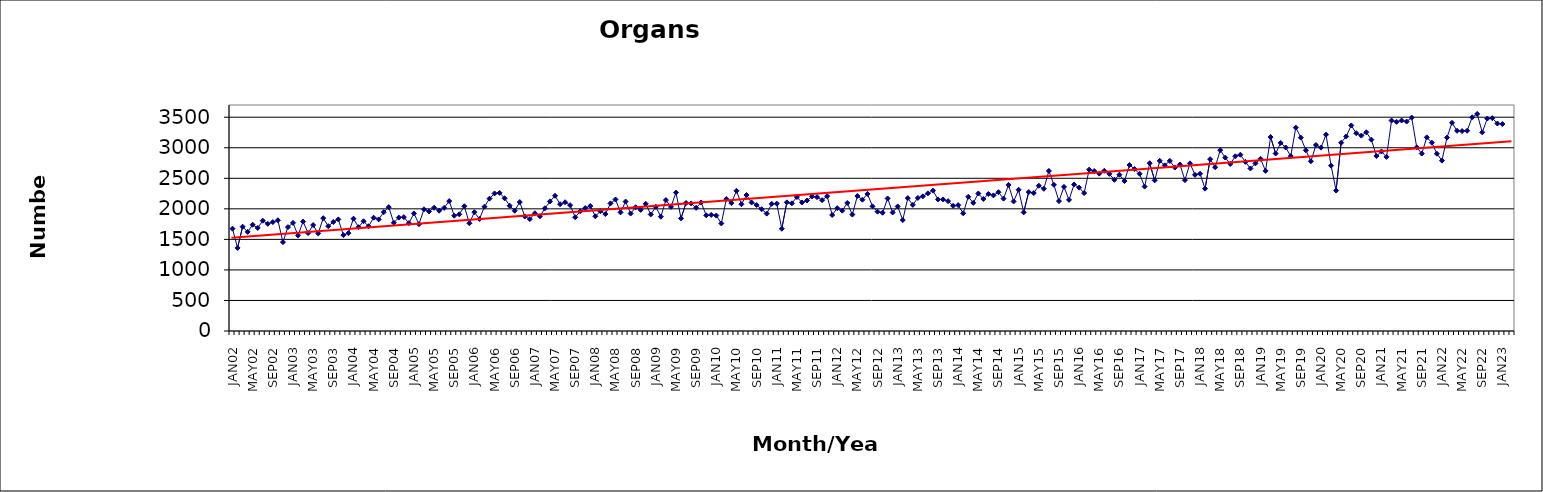
| Category | Series 0 |
|---|---|
| JAN02 | 1675 |
| FEB02 | 1360 |
| MAR02 | 1708 |
| APR02 | 1623 |
| MAY02 | 1740 |
| JUN02 | 1687 |
| JUL02 | 1806 |
| AUG02 | 1755 |
| SEP02 | 1783 |
| OCT02 | 1813 |
| NOV02 | 1455 |
| DEC02 | 1701 |
| JAN03 | 1770 |
| FEB03 | 1565 |
| MAR03 | 1791 |
| APR03 | 1603 |
| MAY03 | 1734 |
| JUN03 | 1598 |
| JUL03 | 1847 |
| AUG03 | 1716 |
| SEP03 | 1785 |
| OCT03 | 1827 |
| NOV03 | 1570 |
| DEC03 | 1602 |
| JAN04 | 1839 |
| FEB04 | 1700 |
| MAR04 | 1797 |
| APR04 | 1715 |
| MAY04 | 1855 |
| JUN04 | 1827 |
| JUL04 | 1945 |
| AUG04 | 2028 |
| SEP04 | 1773 |
| OCT04 | 1857 |
| NOV04 | 1864 |
| DEC04 | 1766 |
| JAN05 | 1925 |
| FEB05 | 1750 |
| MAR05 | 1993 |
| APR05 | 1957 |
| MAY05 | 2018 |
| JUN05 | 1969 |
| JUL05 | 2016 |
| AUG05 | 2127 |
| SEP05 | 1888 |
| OCT05 | 1910 |
| NOV05 | 2042 |
| DEC05 | 1764 |
| JAN06 | 1945 |
| FEB06 | 1834 |
| MAR06 | 2035 |
| APR06 | 2167 |
| MAY06 | 2252 |
| JUN06 | 2261 |
| JUL06 | 2172 |
| AUG06 | 2051 |
| SEP06 | 1969 |
| OCT06 | 2111 |
| NOV06 | 1875 |
| DEC06 | 1832 |
| JAN07 | 1927 |
| FEB07 | 1878 |
| MAR07 | 2009 |
| APR07 | 2122 |
| MAY07 | 2214 |
| JUN07 | 2076 |
| JUL07 | 2108 |
| AUG07 | 2060 |
| SEP07 | 1863 |
| OCT07 | 1959 |
| NOV07 | 2012 |
| DEC07 | 2046 |
| JAN08 | 1878 |
| FEB08 | 1962 |
| MAR08 | 1914 |
| APR08 | 2089 |
| MAY08 | 2153 |
| JUN08 | 1942 |
| JUL08 | 2119 |
| AUG08 | 1923 |
| SEP08 | 2026 |
| OCT08 | 1983 |
| NOV08 | 2082 |
| DEC08 | 1908 |
| JAN09 | 2033 |
| FEB09 | 1871 |
| MAR09 | 2143 |
| APR09 | 2032 |
| MAY09 | 2266 |
| JUN09 | 1844 |
| JUL09 | 2096 |
| AUG09 | 2089 |
| SEP09 | 2016 |
| OCT09 | 2104 |
| NOV09 | 1894 |
| DEC09 | 1901 |
| JAN10 | 1890 |
| FEB10 | 1761 |
| MAR10 | 2160 |
| APR10 | 2094 |
| MAY10 | 2295 |
| JUN10 | 2075 |
| JUL10 | 2226 |
| AUG10 | 2104 |
| SEP10 | 2062 |
| OCT10 | 1994 |
| NOV10 | 1922 |
| DEC10 | 2082 |
| JAN11 | 2085 |
| FEB11 | 1674 |
| MAR11 | 2106 |
| APR11 | 2090 |
| MAY11 | 2194 |
| JUN11 | 2105 |
| JUL11 | 2136 |
| AUG11 | 2202 |
| SEP11 | 2192 |
| OCT11 | 2142 |
| NOV11 | 2207 |
| DEC11 | 1899 |
| JAN12 | 2011 |
| FEB12 | 1970 |
| MAR12 | 2096 |
| APR12 | 1906 |
| MAY12 | 2210 |
| JUN12 | 2150 |
| JUL12 | 2244 |
| AUG12 | 2041 |
| SEP12 | 1954 |
| OCT12 | 1936 |
| NOV12 | 2170 |
| DEC12 | 1941 |
| JAN13 | 2039 |
| FEB13 | 1816 |
| MAR13 | 2175 |
| APR13 | 2065 |
| MAY13 | 2179 |
| JUN13 | 2205 |
| JUL13 | 2254 |
| AUG13 | 2297 |
| SEP13 | 2154 |
| OCT13 | 2154 |
| NOV13 | 2126 |
| DEC13 | 2049 |
| JAN14 | 2061 |
| FEB14 | 1927 |
| MAR14 | 2197 |
| APR14 | 2098 |
| MAY14 | 2251 |
| JUN14 | 2162 |
| JUL14 | 2243 |
| AUG14 | 2220 |
| SEP14 | 2272 |
| OCT14 | 2167 |
| NOV14 | 2391 |
| DEC14 | 2121 |
| JAN15 | 2312 |
| FEB15 | 1942 |
| MAR15 | 2275 |
| APR15 | 2259 |
| MAY15 | 2379 |
| JUN15 | 2328 |
| JUL15 | 2621 |
| AUG15 | 2393 |
| SEP15 | 2127 |
| OCT15 | 2359 |
| NOV15 | 2147 |
| DEC15 | 2398 |
| JAN16 | 2348 |
| FEB16 | 2258 |
| MAR16 | 2642 |
| APR16 | 2619 |
| MAY16 | 2576 |
| JUN16 | 2623 |
| JUL16 | 2573 |
| AUG16 | 2475 |
| SEP16 | 2559 |
| OCT16 | 2455 |
| NOV16 | 2717 |
| DEC16 | 2652 |
| JAN17 | 2574 |
| FEB17 | 2364 |
| MAR17 | 2747 |
| APR17 | 2466 |
| MAY17 | 2786 |
| JUN17 | 2712 |
| JUL17 | 2785 |
| AUG17 | 2676 |
| SEP17 | 2726 |
| OCT17 | 2470 |
| NOV17 | 2745 |
| DEC17 | 2557 |
| JAN18 | 2575 |
| FEB18 | 2331 |
| MAR18 | 2813 |
| APR18 | 2681 |
| MAY18 | 2960 |
| JUN18 | 2839 |
| JUL18 | 2735 |
| AUG18 | 2860 |
| SEP18 | 2886 |
| OCT18 | 2769 |
| NOV18 | 2661 |
| DEC18 | 2745 |
| JAN19 | 2819 |
| FEB19 | 2622 |
| MAR19 | 3175 |
| APR19 | 2906 |
| MAY19 | 3079 |
| JUN19 | 3004 |
| JUL19 | 2863 |
| AUG19 | 3330 |
| SEP19 | 3166 |
| OCT19 | 2958 |
| NOV19 | 2779 |
| DEC19 | 3045 |
| JAN20 | 3002 |
| FEB20 | 3214 |
| MAR20 | 2707 |
| APR20 | 2299 |
| MAY20 | 3082 |
| JUN20 | 3185 |
| JUL20 | 3365 |
| AUG20 | 3238 |
| SEP20 | 3199 |
| OCT20 | 3253 |
| NOV20 | 3133 |
| DEC20 | 2865 |
| JAN21 | 2939 |
| FEB21 | 2850 |
| MAR21 | 3446 |
| APR21 | 3424 |
| MAY21 | 3446 |
| JUN21 | 3429 |
| JUL21 | 3494 |
| AUG21 | 3006 |
| SEP21 | 2905 |
| OCT21 | 3170 |
| NOV21 | 3083 |
| DEC21 | 2902 |
| JAN22 | 2790 |
| FEB22 | 3166 |
| MAR22 | 3409 |
| APR22 | 3278 |
| MAY22 | 3273 |
| JUN22 | 3278 |
| JUL22 | 3499 |
| AUG22 | 3554 |
| SEP22 | 3252 |
| OCT22 | 3478 |
| NOV22 | 3485 |
| DEC22 | 3397 |
| JAN23 | 3388 |